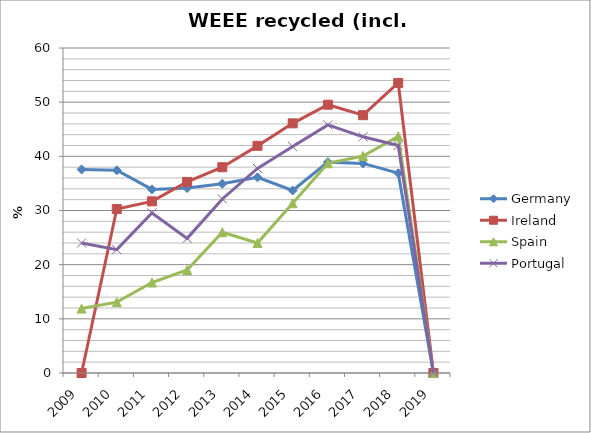
| Category | Germany | Ireland | Spain | Portugal |
|---|---|---|---|---|
| 2009 | 37.58 | 0 | 11.892 | 23.998 |
| 2010 | 37.426 | 30.273 | 13.076 | 22.78 |
| 2011 | 33.896 | 31.691 | 16.702 | 29.548 |
| 2012 | 34.152 | 35.278 | 19.012 | 24.854 |
| 2013 | 34.942 | 37.985 | 25.994 | 32.129 |
| 2014 | 36.122 | 41.934 | 23.993 | 37.758 |
| 2015 | 33.702 | 46.093 | 31.34 | 41.808 |
| 2016 | 38.928 | 49.528 | 38.72 | 45.812 |
| 2017 | 38.696 | 47.598 | 40.054 | 43.605 |
| 2018 | 36.894 | 53.553 | 43.703 | 41.987 |
| 2019 | 0 | 0 | 0 | 0 |